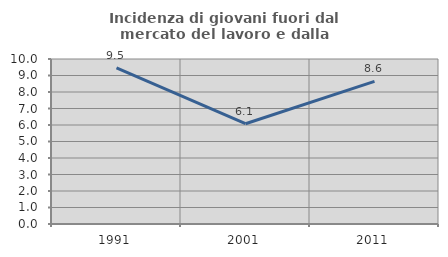
| Category | Incidenza di giovani fuori dal mercato del lavoro e dalla formazione  |
|---|---|
| 1991.0 | 9.465 |
| 2001.0 | 6.077 |
| 2011.0 | 8.642 |